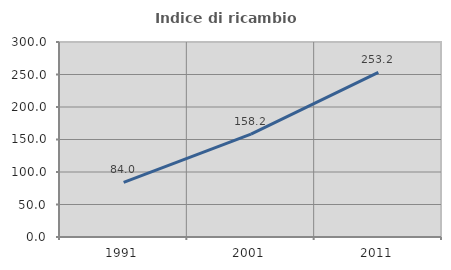
| Category | Indice di ricambio occupazionale  |
|---|---|
| 1991.0 | 83.974 |
| 2001.0 | 158.182 |
| 2011.0 | 253.165 |